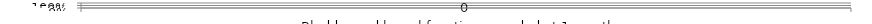
| Category | Series 0 |
|---|---|
| Bladder and bowel function recorded at 1 month | 0 |